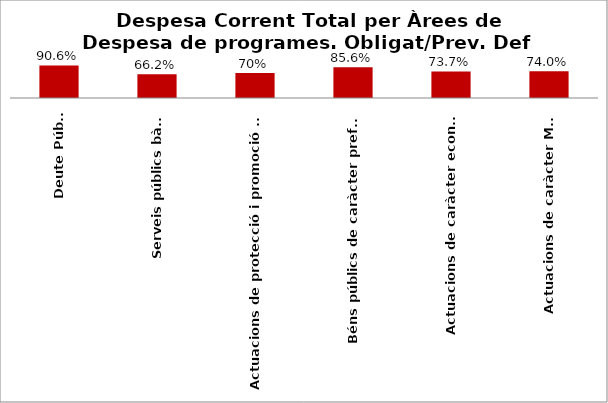
| Category | Series 0 |
|---|---|
| Deute Públic | 0.906 |
| Serveis públics bàsics | 0.662 |
| Actuacions de protecció i promoció social | 0.697 |
| Béns públics de caràcter preferent | 0.856 |
| Actuacions de caràcter econòmic | 0.737 |
| Actuacions de caràcter Marçal | 0.74 |